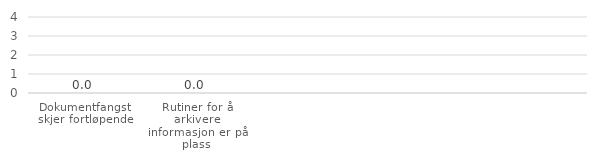
| Category | Series 5 |
|---|---|
| Dokumentfangst skjer fortløpende | 0 |
| Rutiner for å arkivere informasjon er på plass | 0 |